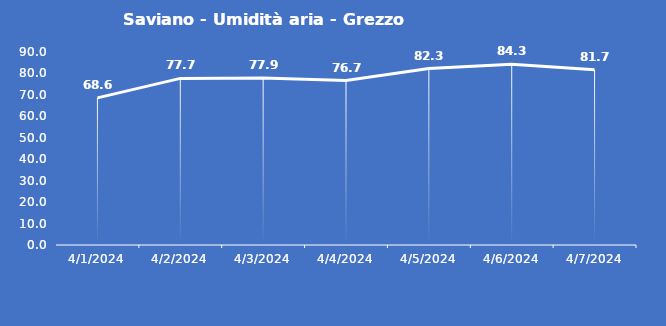
| Category | Saviano - Umidità aria - Grezzo (%) |
|---|---|
| 4/1/24 | 68.6 |
| 4/2/24 | 77.7 |
| 4/3/24 | 77.9 |
| 4/4/24 | 76.7 |
| 4/5/24 | 82.3 |
| 4/6/24 | 84.3 |
| 4/7/24 | 81.7 |